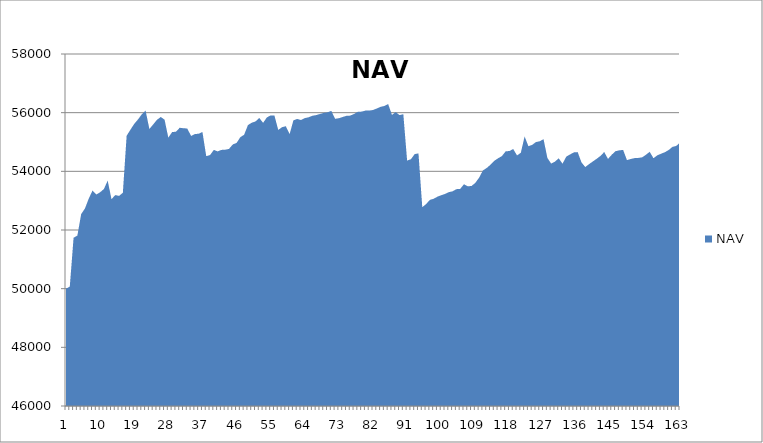
| Category | NAV |
|---|---|
| 0 | 50000 |
| 1 | 50069.444 |
| 2 | 51736.444 |
| 3 | 51809.343 |
| 4 | 52539.343 |
| 5 | 52733.57 |
| 6 | 53070.527 |
| 7 | 53346.212 |
| 8 | 53210.13 |
| 9 | 53285.788 |
| 10 | 53396.685 |
| 11 | 53684.185 |
| 12 | 53050.597 |
| 13 | 53191.058 |
| 14 | 53162.649 |
| 15 | 53270.317 |
| 16 | 55214.762 |
| 17 | 55418.583 |
| 18 | 55617.273 |
| 19 | 55770.477 |
| 20 | 55945.477 |
| 21 | 56069.601 |
| 22 | 55444.601 |
| 23 | 55597.925 |
| 24 | 55757.558 |
| 25 | 55851.308 |
| 26 | 55764.06 |
| 27 | 55148.361 |
| 28 | 55340.028 |
| 29 | 55349.317 |
| 30 | 55485.393 |
| 31 | 55468.704 |
| 32 | 55461.038 |
| 33 | 55205.356 |
| 34 | 55270.356 |
| 35 | 55282.57 |
| 36 | 55341.011 |
| 37 | 54517.482 |
| 38 | 54554.291 |
| 39 | 54731.016 |
| 40 | 54679.093 |
| 41 | 54730.595 |
| 42 | 54736.73 |
| 43 | 54765.085 |
| 44 | 54915.643 |
| 45 | 54969.86 |
| 46 | 55164.665 |
| 47 | 55247.746 |
| 48 | 55575.668 |
| 49 | 55657.905 |
| 50 | 55701.032 |
| 51 | 55819.28 |
| 52 | 55652.834 |
| 53 | 55838.604 |
| 54 | 55905.769 |
| 55 | 55898.888 |
| 56 | 55410.9 |
| 57 | 55504.564 |
| 58 | 55537.603 |
| 59 | 55268.471 |
| 60 | 55737.858 |
| 61 | 55785.708 |
| 62 | 55749.829 |
| 63 | 55815.591 |
| 64 | 55842.34 |
| 65 | 55894.021 |
| 66 | 55916.828 |
| 67 | 55955.697 |
| 68 | 55991.896 |
| 69 | 56012.065 |
| 70 | 56060.293 |
| 71 | 55791.443 |
| 72 | 55810.674 |
| 73 | 55852.843 |
| 74 | 55892.018 |
| 75 | 55900.069 |
| 76 | 55955.739 |
| 77 | 56030.918 |
| 78 | 56036.168 |
| 79 | 56069.975 |
| 80 | 56071.656 |
| 81 | 56090.406 |
| 82 | 56141.798 |
| 83 | 56199.159 |
| 84 | 56228.237 |
| 85 | 56292.573 |
| 86 | 55924.369 |
| 87 | 56019.106 |
| 88 | 55916.165 |
| 89 | 55950.09 |
| 90 | 54367.13 |
| 91 | 54411.811 |
| 92 | 54588.933 |
| 93 | 54611.197 |
| 94 | 52777.117 |
| 95 | 52883.107 |
| 96 | 53025.651 |
| 97 | 53064.908 |
| 98 | 53135.652 |
| 99 | 53186.005 |
| 100 | 53229.789 |
| 101 | 53290.192 |
| 102 | 53319.038 |
| 103 | 53392.112 |
| 104 | 53401.462 |
| 105 | 53559.878 |
| 106 | 53489.526 |
| 107 | 53501.684 |
| 108 | 53607.597 |
| 109 | 53785.178 |
| 110 | 54030.211 |
| 111 | 54113.452 |
| 112 | 54226.272 |
| 113 | 54358.625 |
| 114 | 54444.736 |
| 115 | 54518.421 |
| 116 | 54681.882 |
| 117 | 54693.454 |
| 118 | 54759.719 |
| 119 | 54542.637 |
| 120 | 54631.804 |
| 121 | 55189.582 |
| 122 | 54857.283 |
| 123 | 54902.45 |
| 124 | 54998.878 |
| 125 | 55024.352 |
| 126 | 55097.595 |
| 127 | 54460.788 |
| 128 | 54265.386 |
| 129 | 54330.201 |
| 130 | 54444.032 |
| 131 | 54258.967 |
| 132 | 54502.531 |
| 133 | 54576.689 |
| 134 | 54645.616 |
| 135 | 54655.645 |
| 136 | 54306.491 |
| 137 | 54146.917 |
| 138 | 54245.601 |
| 139 | 54336.218 |
| 140 | 54425.943 |
| 141 | 54524.223 |
| 142 | 54658.516 |
| 143 | 54423.271 |
| 144 | 54567.668 |
| 145 | 54687.668 |
| 146 | 54715.668 |
| 147 | 54729.584 |
| 148 | 54383.43 |
| 149 | 54420.248 |
| 150 | 54450.791 |
| 151 | 54457.1 |
| 152 | 54477.818 |
| 153 | 54563.112 |
| 154 | 54666.053 |
| 155 | 54446.722 |
| 156 | 54545.273 |
| 157 | 54599.818 |
| 158 | 54651.247 |
| 159 | 54725.665 |
| 160 | 54833.165 |
| 161 | 54864.415 |
| 162 | 54983.165 |